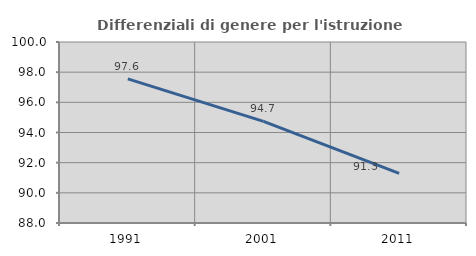
| Category | Differenziali di genere per l'istruzione superiore |
|---|---|
| 1991.0 | 97.551 |
| 2001.0 | 94.737 |
| 2011.0 | 91.296 |